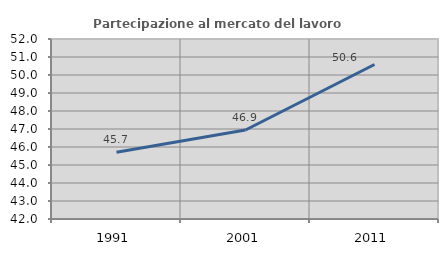
| Category | Partecipazione al mercato del lavoro  femminile |
|---|---|
| 1991.0 | 45.706 |
| 2001.0 | 46.946 |
| 2011.0 | 50.585 |